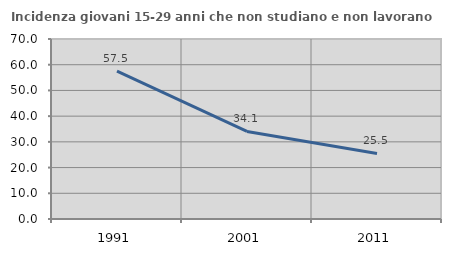
| Category | Incidenza giovani 15-29 anni che non studiano e non lavorano  |
|---|---|
| 1991.0 | 57.471 |
| 2001.0 | 34.068 |
| 2011.0 | 25.513 |